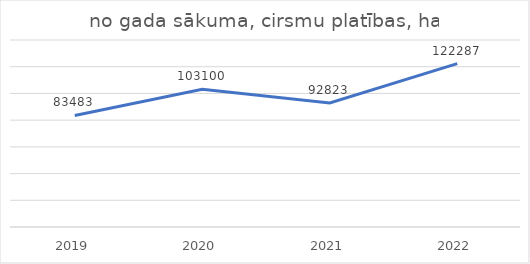
| Category | no gada sākuma, cirsmu platības, ha |
|---|---|
| 2019.0 | 83483 |
| 2020.0 | 103100 |
| 2021.0 | 92823 |
| 2022.0 | 122287 |